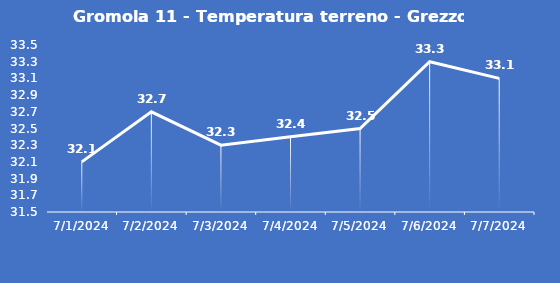
| Category | Gromola 11 - Temperatura terreno - Grezzo (°C) |
|---|---|
| 7/1/24 | 32.1 |
| 7/2/24 | 32.7 |
| 7/3/24 | 32.3 |
| 7/4/24 | 32.4 |
| 7/5/24 | 32.5 |
| 7/6/24 | 33.3 |
| 7/7/24 | 33.1 |